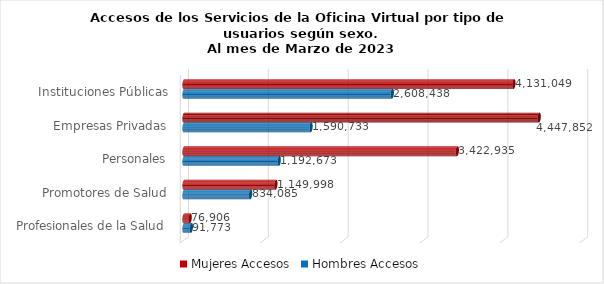
| Category | Mujeres | Hombres |
|---|---|---|
| Instituciones Públicas | 4131049 | 2608438 |
| Empresas Privadas | 4447852 | 1590733 |
| Personales | 3422935 | 1192673 |
| Promotores de Salud | 1149998 | 834085 |
| Profesionales de la Salud | 76906 | 91773 |